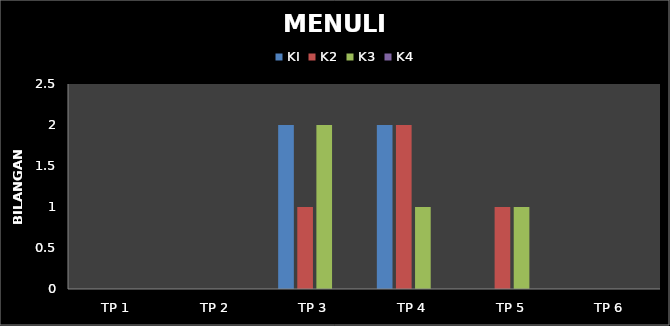
| Category | KI | K2 | K3 | K4 |
|---|---|---|---|---|
| TP 1 | 0 | 0 | 0 | 0 |
| TP 2 | 0 | 0 | 0 | 0 |
| TP 3 | 2 | 1 | 2 | 0 |
| TP 4 | 2 | 2 | 1 | 0 |
| TP 5 | 0 | 1 | 1 | 0 |
| TP 6 | 0 | 0 | 0 | 0 |